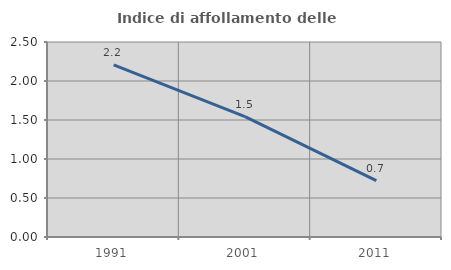
| Category | Indice di affollamento delle abitazioni  |
|---|---|
| 1991.0 | 2.207 |
| 2001.0 | 1.543 |
| 2011.0 | 0.722 |